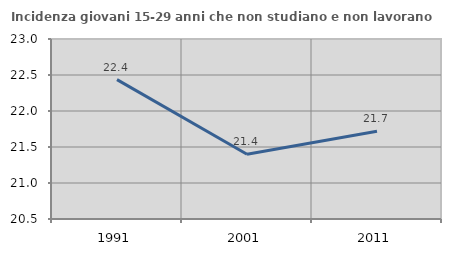
| Category | Incidenza giovani 15-29 anni che non studiano e non lavorano  |
|---|---|
| 1991.0 | 22.436 |
| 2001.0 | 21.399 |
| 2011.0 | 21.718 |